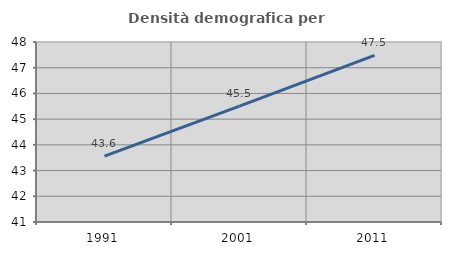
| Category | Densità demografica |
|---|---|
| 1991.0 | 43.565 |
| 2001.0 | 45.504 |
| 2011.0 | 47.48 |